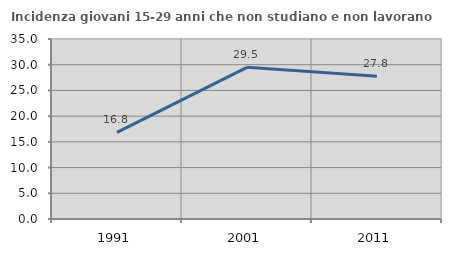
| Category | Incidenza giovani 15-29 anni che non studiano e non lavorano  |
|---|---|
| 1991.0 | 16.846 |
| 2001.0 | 29.5 |
| 2011.0 | 27.778 |